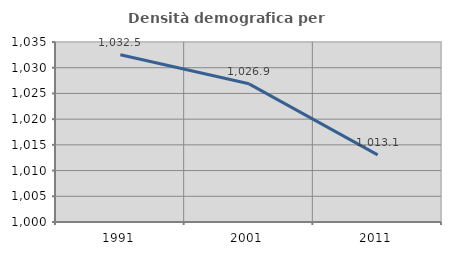
| Category | Densità demografica |
|---|---|
| 1991.0 | 1032.53 |
| 2001.0 | 1026.866 |
| 2011.0 | 1013.061 |